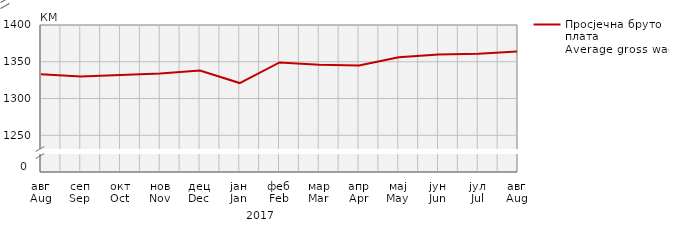
| Category | Просјечна бруто плата
Average gross wage |
|---|---|
| авг
Aug | 1333 |
| сеп
Sep | 1330 |
| окт
Oct | 1332 |
| нов
Nov | 1334 |
| дец
Dec | 1338 |
| јан
Jan | 1321 |
| феб
Feb | 1349 |
| мар
Mar | 1346 |
| апр
Apr | 1345 |
| мај
May | 1356 |
| јун
Jun | 1360 |
| јул
Jul | 1361 |
| авг
Aug | 1364 |